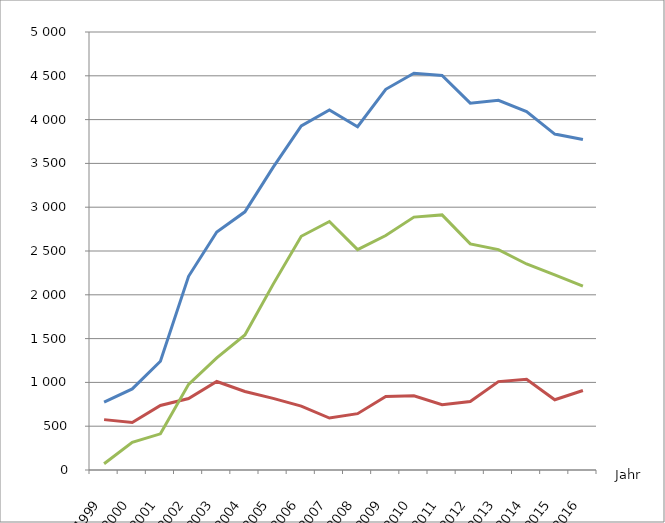
| Category | Verfahren
Insgesamt | von 
Unternehmen1 | von 
Verbrauchern |
|---|---|---|---|
| 1999.0 | 775 | 575 | 71 |
| 2000.0 | 926 | 543 | 316 |
| 2001.0 | 1241 | 737 | 413 |
| 2002.0 | 2211 | 816 | 978 |
| 2003.0 | 2717 | 1010 | 1281 |
| 2004.0 | 2947 | 896 | 1542 |
| 2005.0 | 3455 | 818 | 2119 |
| 2006.0 | 3929 | 729 | 2668 |
| 2007.0 | 4110 | 593 | 2837 |
| 2008.0 | 3919 | 643 | 2516 |
| 2009.0 | 4346 | 838 | 2677 |
| 2010.0 | 4530 | 847 | 2887 |
| 2011.0 | 4503 | 745 | 2912 |
| 2012.0 | 4188 | 781 | 2581 |
| 2013.0 | 4220 | 1009 | 2516 |
| 2014.0 | 4091 | 1035 | 2352 |
| 2015.0 | 3835 | 802 | 2228 |
| 2016.0 | 3772 | 907 | 2099 |